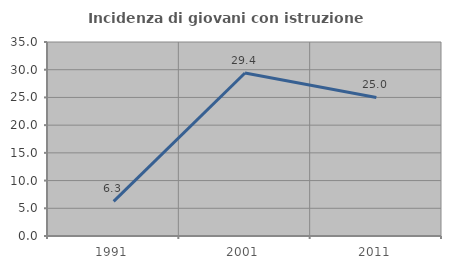
| Category | Incidenza di giovani con istruzione universitaria |
|---|---|
| 1991.0 | 6.25 |
| 2001.0 | 29.412 |
| 2011.0 | 25 |